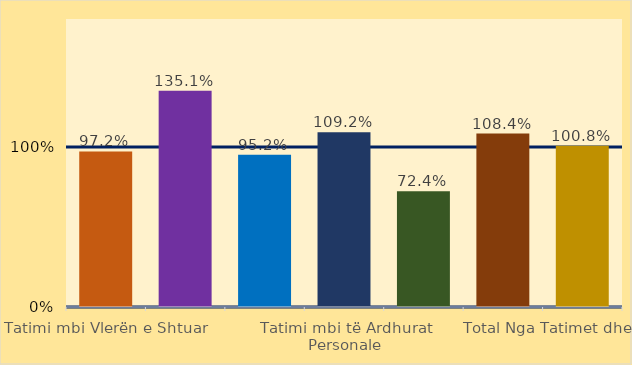
| Category | Norma e Realizimit |
|---|---|
| Tatimi mbi Vlerën e Shtuar | 0.972 |
| Tatimi mbi Fitimin | 1.351 |
| Akcizat | 0.952 |
| Tatimi mbi të Ardhurat Personale | 1.092 |
| Taksa Nacionale dhe të tjera | 0.724 |
| Taksa Doganore | 1.084 |
| Total Nga Tatimet dhe Doganat | 1.008 |